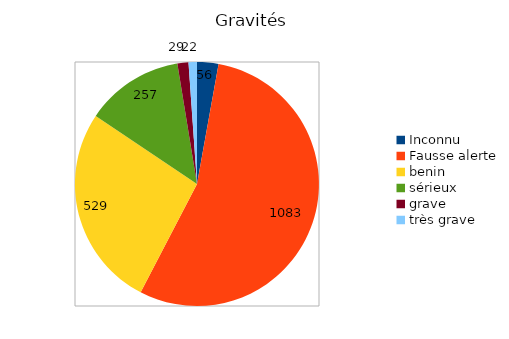
| Category | Series 0 |
|---|---|
| Inconnu | 56 |
| Fausse alerte | 1083 |
| benin | 529 |
| sérieux | 257 |
| grave | 29 |
| très grave | 22 |